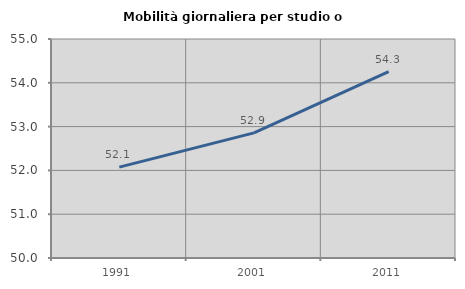
| Category | Mobilità giornaliera per studio o lavoro |
|---|---|
| 1991.0 | 52.076 |
| 2001.0 | 52.857 |
| 2011.0 | 54.256 |